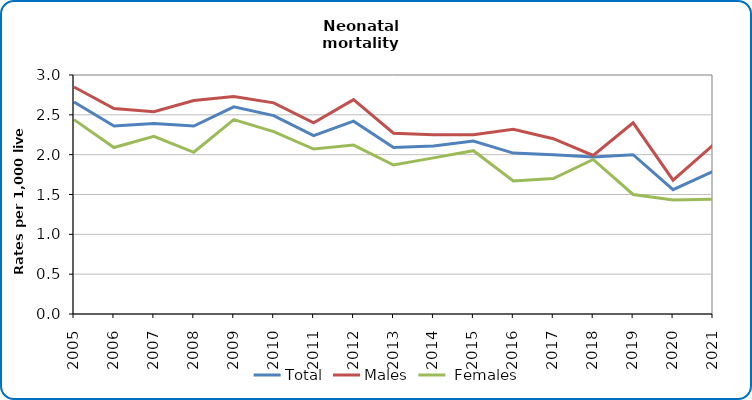
| Category | Total | Males |  Females |
|---|---|---|---|
| 2005.0 | 2.66 | 2.85 | 2.44 |
| 2006.0 | 2.36 | 2.58 | 2.09 |
| 2007.0 | 2.39 | 2.54 | 2.23 |
| 2008.0 | 2.36 | 2.68 | 2.03 |
| 2009.0 | 2.6 | 2.73 | 2.44 |
| 2010.0 | 2.49 | 2.65 | 2.29 |
| 2011.0 | 2.24 | 2.4 | 2.07 |
| 2012.0 | 2.42 | 2.69 | 2.12 |
| 2013.0 | 2.09 | 2.27 | 1.87 |
| 2014.0 | 2.11 | 2.25 | 1.96 |
| 2015.0 | 2.17 | 2.25 | 2.05 |
| 2016.0 | 2.02 | 2.32 | 1.67 |
| 2017.0 | 2 | 2.2 | 1.7 |
| 2018.0 | 1.97 | 1.99 | 1.94 |
| 2019.0 | 2 | 2.4 | 1.5 |
| 2020.0 | 1.56 | 1.68 | 1.43 |
| 2021.0 | 1.79 | 2.12 | 1.44 |